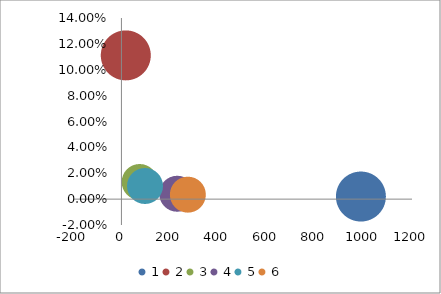
| Category | Series 0 |
|---|---|
| 989.0 | 0.002 |
| 18.0 | 0.111 |
| 74.0 | 0.014 |
| 229.0 | 0.004 |
| 96.0 | 0.01 |
| 273.0 | 0.004 |